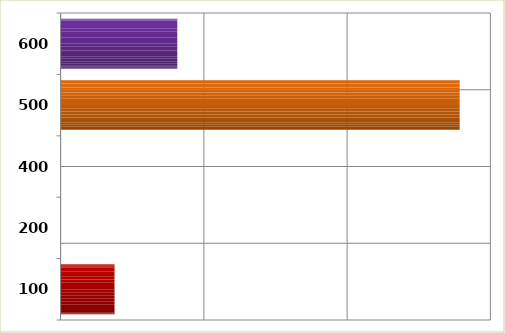
| Category | Series 0 |
|---|---|
| 100.0 | 3763234 |
| 200.0 | 0 |
| 400.0 | 0 |
| 500.0 | 27854305 |
| 600.0 | 8144760 |